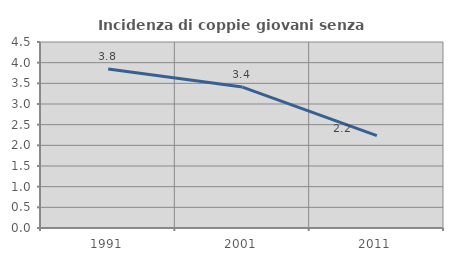
| Category | Incidenza di coppie giovani senza figli |
|---|---|
| 1991.0 | 3.846 |
| 2001.0 | 3.409 |
| 2011.0 | 2.236 |